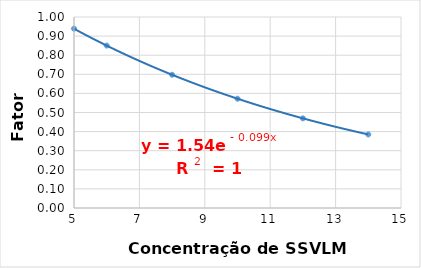
| Category | Fator a |
|---|---|
| 5.0 | 0.939 |
| 6.0 | 0.85 |
| 8.0 | 0.698 |
| 10.0 | 0.572 |
| 12.0 | 0.469 |
| 14.0 | 0.385 |